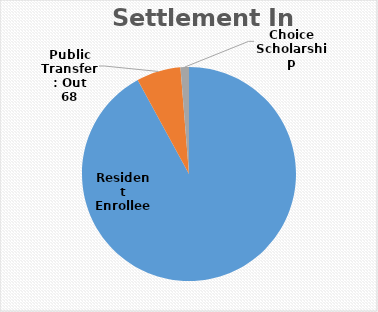
| Category | Series 0 |
|---|---|
| Resident Enrollee | 937 |
| Public Transfer: Out | 68 |
| Choice Scholarship | 13 |